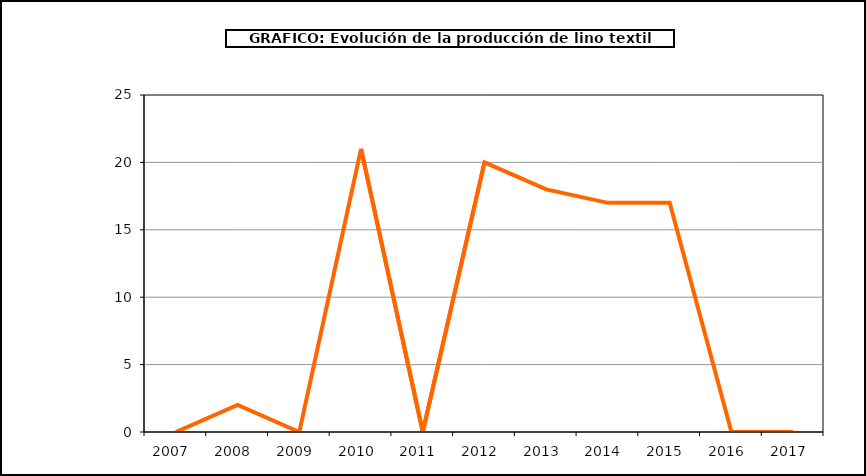
| Category | producción |
|---|---|
| 2007.0 | 0 |
| 2008.0 | 2 |
| 2009.0 | 0 |
| 2010.0 | 21 |
| 2011.0 | 0 |
| 2012.0 | 20 |
| 2013.0 | 18 |
| 2014.0 | 17 |
| 2015.0 | 17 |
| 2016.0 | 0 |
| 2017.0 | 0 |